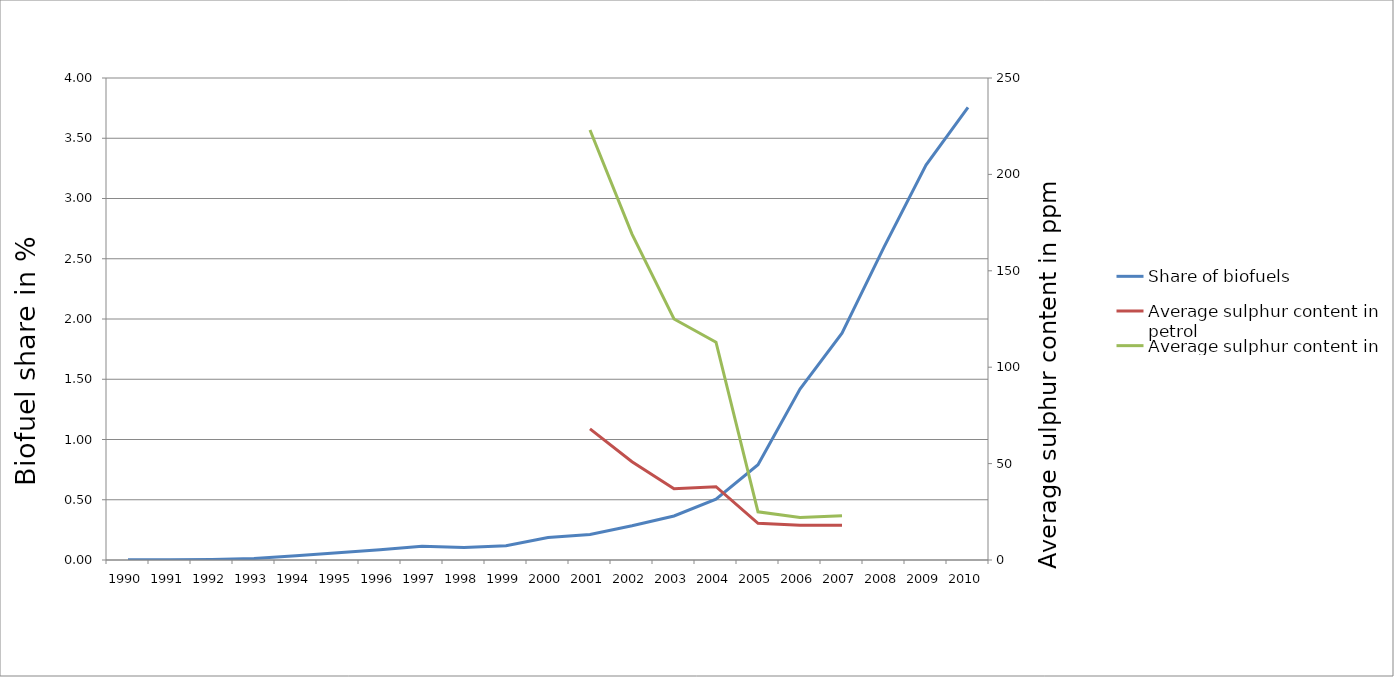
| Category | Share of biofuels |
|---|---|
| 1990.0 | 0.002 |
| 1991.0 | 0.002 |
| 1992.0 | 0.005 |
| 1993.0 | 0.013 |
| 1994.0 | 0.036 |
| 1995.0 | 0.06 |
| 1996.0 | 0.085 |
| 1997.0 | 0.113 |
| 1998.0 | 0.103 |
| 1999.0 | 0.118 |
| 2000.0 | 0.187 |
| 2001.0 | 0.211 |
| 2002.0 | 0.284 |
| 2003.0 | 0.365 |
| 2004.0 | 0.505 |
| 2005.0 | 0.79 |
| 2006.0 | 1.418 |
| 2007.0 | 1.882 |
| 2008.0 | 2.596 |
| 2009.0 | 3.278 |
| 2010.0 | 3.756 |